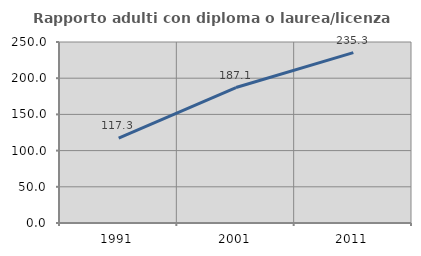
| Category | Rapporto adulti con diploma o laurea/licenza media  |
|---|---|
| 1991.0 | 117.33 |
| 2001.0 | 187.103 |
| 2011.0 | 235.272 |